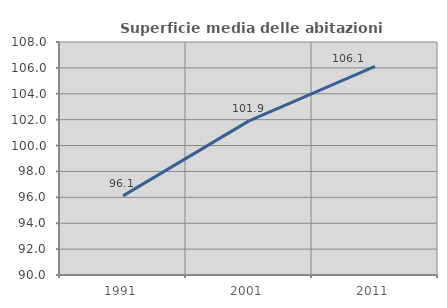
| Category | Superficie media delle abitazioni occupate |
|---|---|
| 1991.0 | 96.112 |
| 2001.0 | 101.907 |
| 2011.0 | 106.122 |